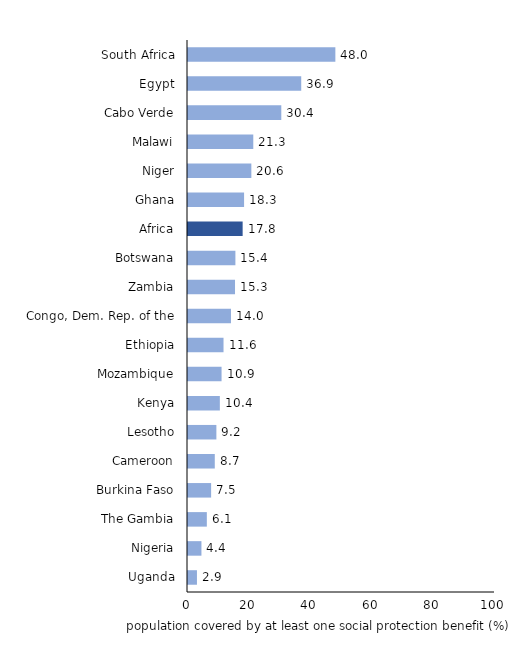
| Category | Population covered by at least one social protection benefit, % of total population |
|---|---|
| Uganda | 2.917 |
| Nigeria | 4.376 |
| The Gambia | 6.135 |
| Burkina Faso | 7.53 |
| Cameroon | 8.727 |
| Lesotho | 9.245 |
| Kenya | 10.374 |
| Mozambique | 10.93 |
| Ethiopia | 11.57 |
| Congo, Dem. Rep. of the | 14 |
| Zambia | 15.313 |
| Botswana | 15.44 |
| Africa | 17.8 |
| Ghana | 18.266 |
| Niger | 20.633 |
| Malawi | 21.267 |
| Cabo Verde | 30.39 |
| Egypt | 36.881 |
| South Africa | 48 |